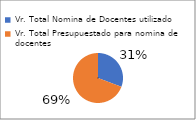
| Category | Series 0 |
|---|---|
| Vr. Total Nomina de Docentes utilizado | 34432015835 |
| Vr. Total Presupuestado para nomina de docentes | 77601157528 |